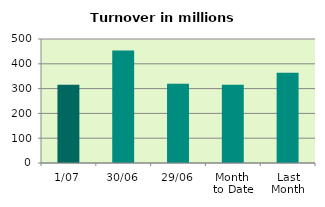
| Category | Series 0 |
|---|---|
| 1/07 | 315.619 |
| 30/06 | 453.325 |
| 29/06 | 319.086 |
| Month 
to Date | 315.619 |
| Last
Month | 364.182 |